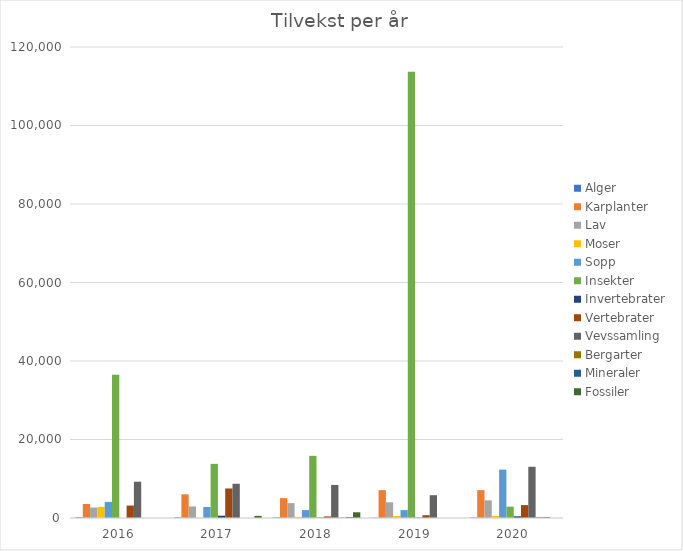
| Category | Alger | Karplanter | Lav | Moser | Sopp | Insekter | Invertebrater | Vertebrater | Vevssamling | Bergarter | Mineraler | Fossiler |
|---|---|---|---|---|---|---|---|---|---|---|---|---|
| 2016.0 | 175 | 3567 | 2667 | 2850 | 4100 | 36477 | 0 | 3170 | 9251 | 0 | 0 | 0 |
| 2017.0 | 150 | 6026 | 2936 | 65 | 2814 | 13791 | 596 | 7528 | 8719 | 0 | 0 | 540 |
| 2018.0 | 150 | 5061 | 3785 | 300 | 2019 | 15834 | 99 | 402 | 8420 | 100 | 228 | 1457 |
| 2019.0 | 70 | 7100 | 4000 | 500 | 2019 | 113669 | 99 | 713 | 5809 | 0 | 0 | 0 |
| 2020.0 | 114 | 7100 | 4500 | 500 | 12331 | 2890 | 433 | 3292 | 13050 | 217 | 199 | 0 |